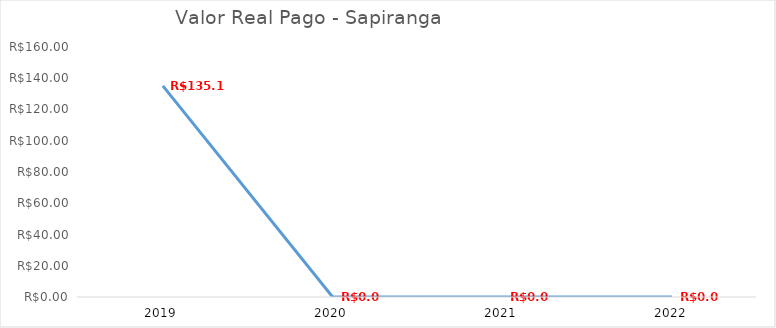
| Category | Series 0 |
|---|---|
| 2019.0 | 135.13 |
| 2020.0 | 0 |
| 2021.0 | 0 |
| 2022.0 | 0 |